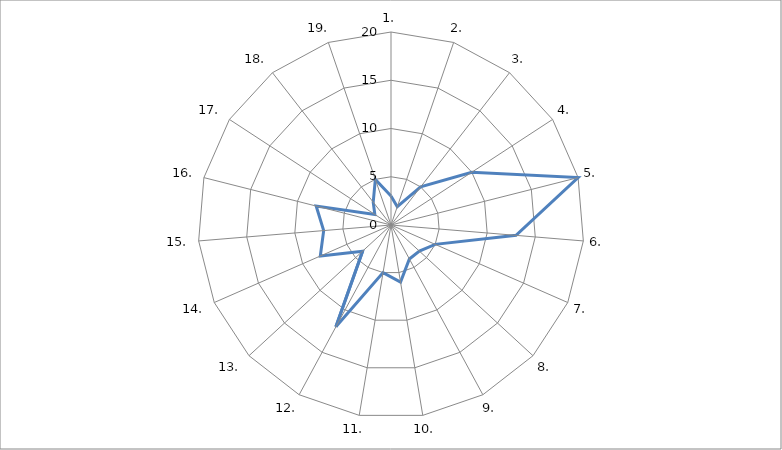
| Category | Series 0 |
|---|---|
| 1. | 3 |
| 2. | 2 |
| 3. | 5 |
| 4. | 10 |
| 5. | 20 |
| 6. | 13 |
| 7. | 5 |
| 8. | 4 |
| 9. | 4 |
| 10. | 6 |
| 11. | 5 |
| 12. | 12 |
| 13. | 4 |
| 14. | 8 |
| 15. | 7 |
| 16. | 8 |
| 17. | 2 |
| 18. | 3 |
| 19. | 5 |